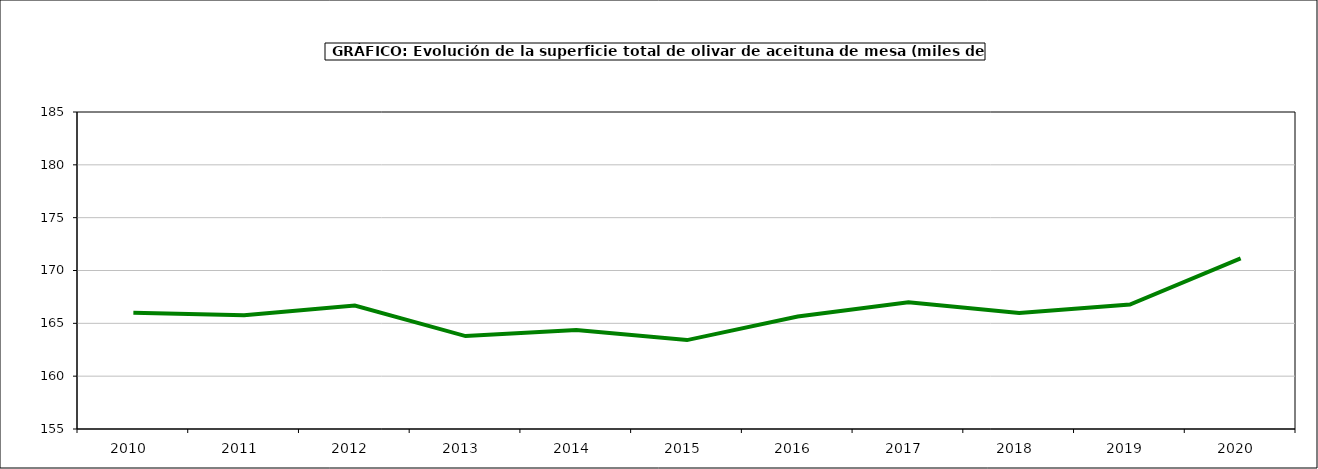
| Category | superficie |
|---|---|
| 2010.0 | 166.006 |
| 2011.0 | 165.762 |
| 2012.0 | 166.679 |
| 2013.0 | 163.795 |
| 2014.0 | 164.379 |
| 2015.0 | 163.414 |
| 2016.0 | 165.647 |
| 2017.0 | 166.997 |
| 2018.0 | 165.98 |
| 2019.0 | 166.774 |
| 2020.0 | 171.152 |